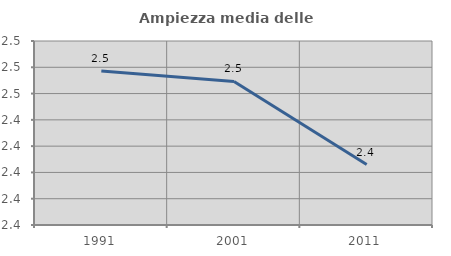
| Category | Ampiezza media delle famiglie |
|---|---|
| 1991.0 | 2.477 |
| 2001.0 | 2.469 |
| 2011.0 | 2.406 |